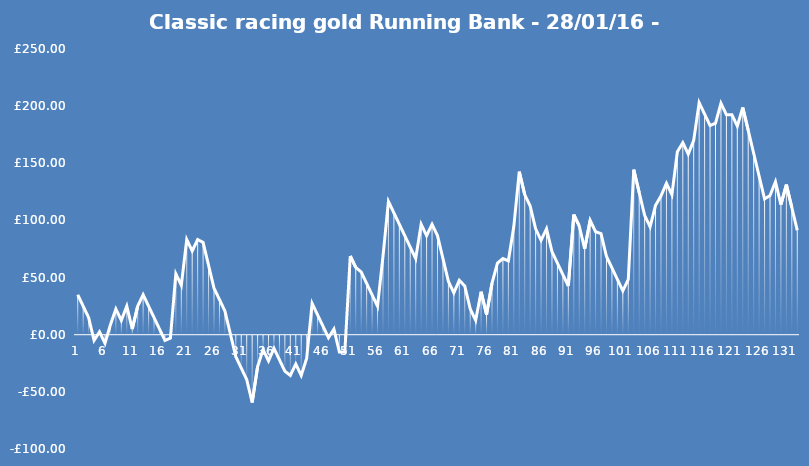
| Category | Running Bank |
|---|---|
| 0 | 35 |
| 1 | 25 |
| 2 | 15 |
| 3 | -5 |
| 4 | 2.5 |
| 5 | -7.5 |
| 6 | 8.75 |
| 7 | 22.5 |
| 8 | 12.5 |
| 9 | 25 |
| 10 | 5 |
| 11 | 25 |
| 12 | 35 |
| 13 | 25 |
| 14 | 15 |
| 15 | 5 |
| 16 | -5 |
| 17 | -3 |
| 18 | 53.267 |
| 19 | 43.267 |
| 20 | 83.267 |
| 21 | 73.267 |
| 22 | 83.267 |
| 23 | 80.767 |
| 24 | 60.767 |
| 25 | 40.767 |
| 26 | 30.767 |
| 27 | 20.767 |
| 28 | 0.767 |
| 29 | -19.233 |
| 30 | -29.233 |
| 31 | -39.233 |
| 32 | -59.233 |
| 33 | -27.933 |
| 34 | -12.933 |
| 35 | -22.933 |
| 36 | -11.933 |
| 37 | -21.933 |
| 38 | -31.933 |
| 39 | -35.633 |
| 40 | -25.633 |
| 41 | -35.633 |
| 42 | -20.633 |
| 43 | 27.367 |
| 44 | 17.367 |
| 45 | 7.367 |
| 46 | -2.633 |
| 47 | 4.9 |
| 48 | -15.1 |
| 49 | -15.1 |
| 50 | 68.9 |
| 51 | 58.9 |
| 52 | 54.9 |
| 53 | 44.9 |
| 54 | 34.9 |
| 55 | 24.9 |
| 56 | 68.633 |
| 57 | 116.633 |
| 58 | 106.633 |
| 59 | 96.633 |
| 60 | 86.633 |
| 61 | 76.633 |
| 62 | 66.633 |
| 63 | 96.633 |
| 64 | 86.633 |
| 65 | 96.633 |
| 66 | 86.633 |
| 67 | 66.633 |
| 68 | 46.633 |
| 69 | 36.633 |
| 70 | 47.633 |
| 71 | 42.633 |
| 72 | 22.633 |
| 73 | 12.633 |
| 74 | 37.633 |
| 75 | 17.633 |
| 76 | 45.133 |
| 77 | 62.633 |
| 78 | 66.633 |
| 79 | 64.633 |
| 80 | 94.633 |
| 81 | 142.633 |
| 82 | 122.633 |
| 83 | 112.633 |
| 84 | 92.633 |
| 85 | 82.633 |
| 86 | 92.633 |
| 87 | 72.633 |
| 88 | 62.633 |
| 89 | 52.633 |
| 90 | 42.633 |
| 91 | 105.133 |
| 92 | 95.133 |
| 93 | 75.133 |
| 94 | 100.133 |
| 95 | 90.133 |
| 96 | 88.433 |
| 97 | 68.433 |
| 98 | 58.433 |
| 99 | 48.433 |
| 100 | 38.433 |
| 101 | 48.433 |
| 102 | 144.433 |
| 103 | 124.433 |
| 104 | 104.433 |
| 105 | 94.433 |
| 106 | 113.167 |
| 107 | 121.5 |
| 108 | 132.5 |
| 109 | 122.5 |
| 110 | 160.033 |
| 111 | 168.033 |
| 112 | 158.033 |
| 113 | 170.033 |
| 114 | 203.033 |
| 115 | 193.033 |
| 116 | 183.033 |
| 117 | 185.033 |
| 118 | 202.533 |
| 119 | 192.533 |
| 120 | 192.533 |
| 121 | 182.533 |
| 122 | 198.8 |
| 123 | 178.8 |
| 124 | 158.8 |
| 125 | 138.8 |
| 126 | 118.8 |
| 127 | 121.8 |
| 128 | 133.8 |
| 129 | 113.8 |
| 130 | 131.3 |
| 131 | 111.3 |
| 132 | 91.3 |